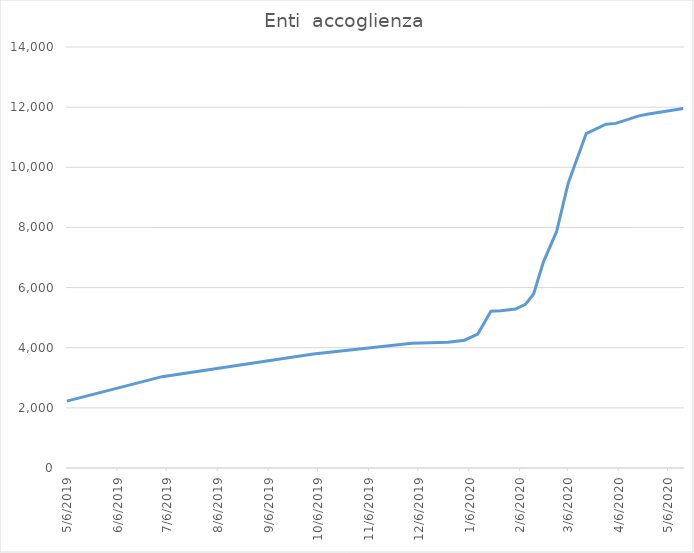
| Category | Enti  accoglienza |
|---|---|
| 5/6/19 | 2223 |
| 7/3/19 | 3038 |
| 10/3/19 | 3793 |
| 12/2/19 | 4149 |
| 12/24/19 | 4181 |
| 1/3/20 | 4249 |
| 1/11/20 | 4450 |
| 1/19/20 | 5214 |
| 1/25/20 | 5229 |
| 2/3/20 | 5285 |
| 2/9/20 | 5443 |
| 2/14/20 | 5787 |
| 2/20/20 | 6854 |
| 2/28/20 | 7861 |
| 3/6/20 | 9465 |
| 3/17/20 | 11122 |
| 3/29/20 | 11433 |
| 4/4/20 | 11460 |
| 4/18/20 | 11710 |
| 4/24/20 | 11770 |
| 5/15/20 | 11953 |